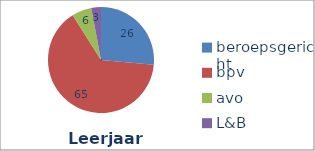
| Category | Series 0 |
|---|---|
| beroepsgericht | 26.408 |
| bpv | 64.635 |
| avo | 6.002 |
| L&B | 2.955 |